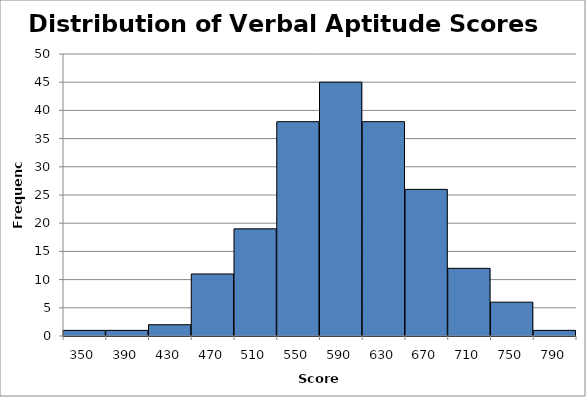
| Category | Series 0 |
|---|---|
| 350.0 | 1 |
| 390.0 | 1 |
| 430.0 | 2 |
| 470.0 | 11 |
| 510.0 | 19 |
| 550.0 | 38 |
| 590.0 | 45 |
| 630.0 | 38 |
| 670.0 | 26 |
| 710.0 | 12 |
| 750.0 | 6 |
| 790.0 | 1 |